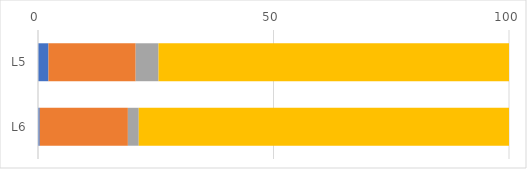
| Category | Series 0 | Series 1 | Series 2 | Series 3 |
|---|---|---|---|---|
| L5 | 2.227 | 18.513 | 4.853 | 74.407 |
| L6 | 0.376 | 18.708 | 2.307 | 78.609 |